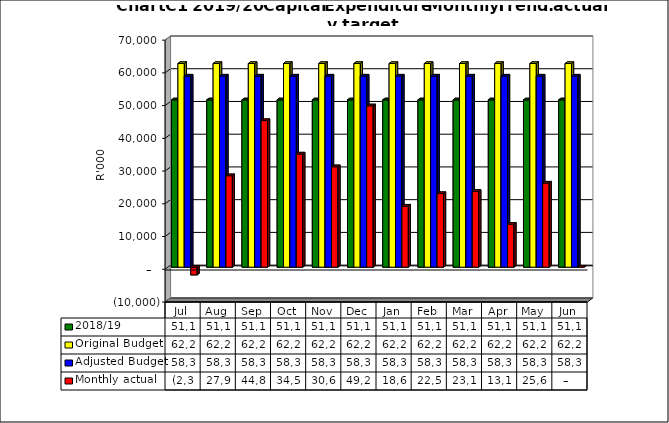
| Category | 2018/19 | Original Budget | Adjusted Budget | Monthly actual |
|---|---|---|---|---|
| Jul | 51123878.417 | 62228094.726 | 58394184.533 | -2354849.52 |
| Aug | 51123878.417 | 62228094.726 | 58394184.533 | 27946048.88 |
| Sep | 51123878.417 | 62228094.726 | 58394184.533 | 44802722.43 |
| Oct | 51123878.417 | 62228094.726 | 58394184.533 | 34585671.62 |
| Nov | 51123878.417 | 62228094.726 | 58394184.533 | 30698547.06 |
| Dec | 51123878.417 | 62228094.726 | 58394184.533 | 49297719.75 |
| Jan | 51123878.417 | 62228094.726 | 58394184.533 | 18669297.1 |
| Feb | 51123878.417 | 62228094.726 | 58394184.533 | 22500413.45 |
| Mar | 51123878.417 | 62228094.726 | 58394184.533 | 23150031.02 |
| Apr | 51123878.417 | 62228094.726 | 58394184.533 | 13147302.03 |
| May | 51123878.417 | 62228094.726 | 58394184.533 | 25696555.78 |
| Jun | 51123878.417 | 62228094.726 | 58394184.533 | 0 |